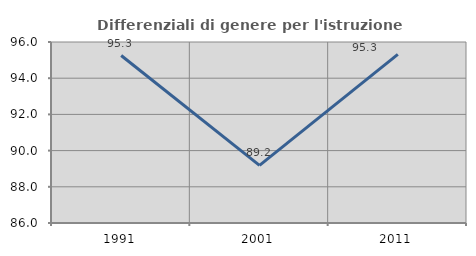
| Category | Differenziali di genere per l'istruzione superiore |
|---|---|
| 1991.0 | 95.252 |
| 2001.0 | 89.182 |
| 2011.0 | 95.318 |